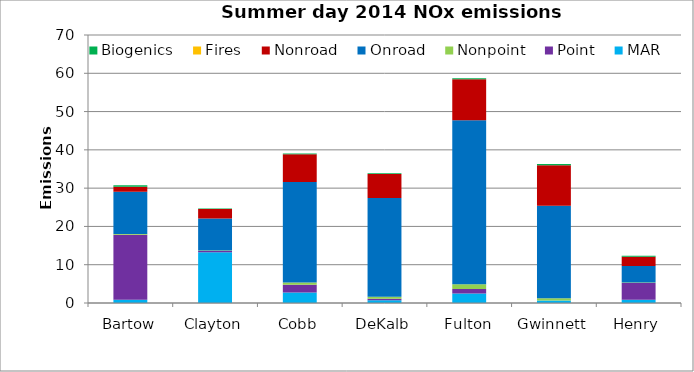
| Category | MAR | Point | Nonpoint | Onroad | Nonroad | Fires | Biogenics |
|---|---|---|---|---|---|---|---|
| Bartow | 0.845 | 17.013 | 0.143 | 11.035 | 1.297 | 0.001 | 0.432 |
| Clayton | 13.275 | 0.277 | 0.15 | 8.39 | 2.45 | 0 | 0.142 |
| Cobb | 2.726 | 2.05 | 0.594 | 26.233 | 7.236 | 0 | 0.22 |
| DeKalb | 0.748 | 0.334 | 0.53 | 25.839 | 6.272 | 0 | 0.164 |
| Fulton | 2.489 | 1.165 | 1.234 | 42.832 | 10.741 | 0 | 0.27 |
| Gwinnett | 0.641 | 0.001 | 0.58 | 24.182 | 10.579 | 0 | 0.326 |
| Henry | 0.82 | 4.375 | 0.133 | 4.352 | 2.379 | 0 | 0.297 |